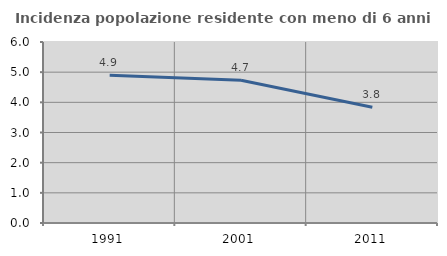
| Category | Incidenza popolazione residente con meno di 6 anni |
|---|---|
| 1991.0 | 4.896 |
| 2001.0 | 4.733 |
| 2011.0 | 3.838 |